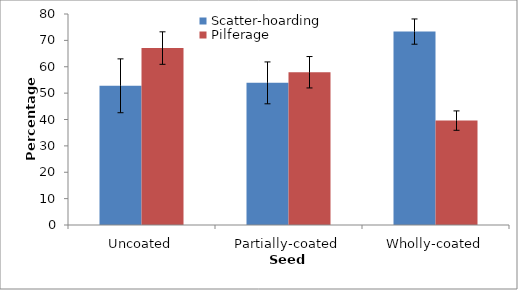
| Category | Scatter-hoarding | Pilferage |
|---|---|---|
| Uncoated | 52.778 | 67.083 |
| Partially-coated | 53.889 | 57.917 |
| Wholly-coated | 73.333 | 39.583 |